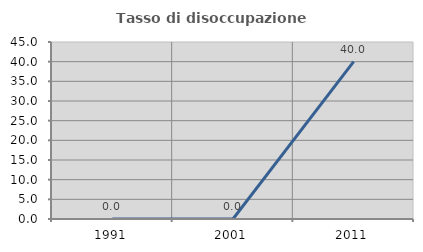
| Category | Tasso di disoccupazione giovanile  |
|---|---|
| 1991.0 | 0 |
| 2001.0 | 0 |
| 2011.0 | 40 |